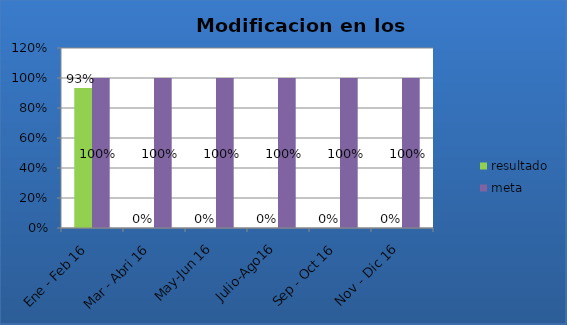
| Category | resultado | meta |
|---|---|---|
| Ene - Feb 16 | 0.933 | 1 |
| Mar - Abri 16 | 0 | 1 |
| May-Jun 16 | 0 | 1 |
| Julio-Ago16 | 0 | 1 |
| Sep - Oct 16 | 0 | 1 |
| Nov - Dic 16 | 0 | 1 |